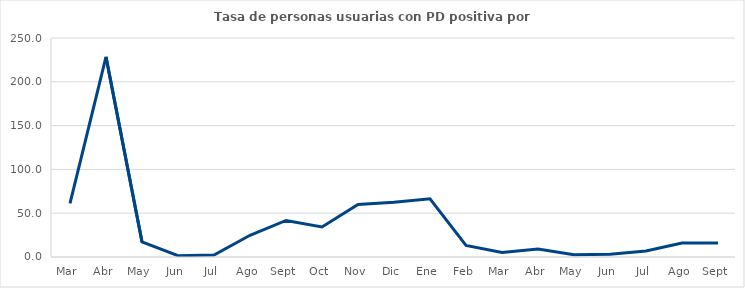
| Category | Series 0 |
|---|---|
| 0 | 61.172 |
| 1 | 228.429 |
| 2 | 17.298 |
| 3 | 1.521 |
| 4 | 2.204 |
| 5 | 24.815 |
| 6 | 41.727 |
| 7 | 34.344 |
| 8 | 59.834 |
| 9 | 62.38 |
| 10 | 66.354 |
| 11 | 13.26 |
| 12 | 5.122 |
| 13 | 9.056 |
| 14 | 2.475 |
| 15 | 3.127 |
| 16 | 6.756 |
| 17 | 16.06 |
| 18 | 15.891 |